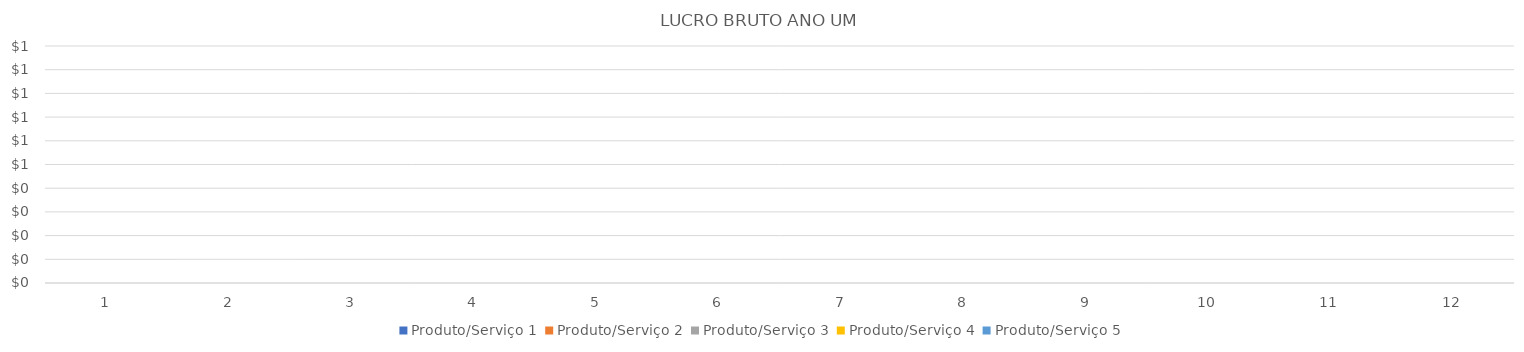
| Category | Produto/Serviço 1 | Produto/Serviço 2 | Produto/Serviço 3 | Produto/Serviço 4 | Produto/Serviço 5 |
|---|---|---|---|---|---|
| 0 | 0 | 0 | 0 | 0 | 0 |
| 1 | 0 | 0 | 0 | 0 | 0 |
| 2 | 0 | 0 | 0 | 0 | 0 |
| 3 | 0 | 0 | 0 | 0 | 0 |
| 4 | 0 | 0 | 0 | 0 | 0 |
| 5 | 0 | 0 | 0 | 0 | 0 |
| 6 | 0 | 0 | 0 | 0 | 0 |
| 7 | 0 | 0 | 0 | 0 | 0 |
| 8 | 0 | 0 | 0 | 0 | 0 |
| 9 | 0 | 0 | 0 | 0 | 0 |
| 10 | 0 | 0 | 0 | 0 | 0 |
| 11 | 0 | 0 | 0 | 0 | 0 |